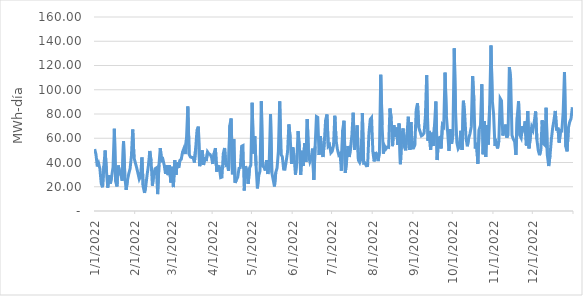
| Category | Excendentes totales [MWh] |
|---|---|
| 1/1/22 | 51.057 |
| 1/2/22 | 46.725 |
| 1/3/22 | 36.693 |
| 1/4/22 | 39.289 |
| 1/5/22 | 34.856 |
| 1/6/22 | 22.641 |
| 1/7/22 | 19.558 |
| 1/8/22 | 37.028 |
| 1/9/22 | 49.878 |
| 1/10/22 | 32.708 |
| 1/11/22 | 19.231 |
| 1/12/22 | 29.342 |
| 1/13/22 | 22.681 |
| 1/14/22 | 28.67 |
| 1/15/22 | 36.096 |
| 1/16/22 | 67.793 |
| 1/17/22 | 24.349 |
| 1/18/22 | 20.233 |
| 1/19/22 | 37.515 |
| 1/20/22 | 32.56 |
| 1/21/22 | 29.501 |
| 1/22/22 | 25.002 |
| 1/23/22 | 57.398 |
| 1/24/22 | 28.121 |
| 1/25/22 | 17.482 |
| 1/26/22 | 25.341 |
| 1/27/22 | 30.878 |
| 1/28/22 | 34.883 |
| 1/29/22 | 45.313 |
| 1/30/22 | 67.203 |
| 1/31/22 | 43.865 |
| 2/1/22 | 39.763 |
| 2/2/22 | 35.76 |
| 2/3/22 | 31.081 |
| 2/4/22 | 26.261 |
| 2/5/22 | 28.488 |
| 2/6/22 | 44.186 |
| 2/7/22 | 20.02 |
| 2/8/22 | 14.933 |
| 2/9/22 | 20.946 |
| 2/10/22 | 30.059 |
| 2/11/22 | 37.817 |
| 2/12/22 | 49.503 |
| 2/13/22 | 41.208 |
| 2/14/22 | 20.891 |
| 2/15/22 | 30.123 |
| 2/16/22 | 34.804 |
| 2/17/22 | 35.525 |
| 2/18/22 | 13.925 |
| 2/19/22 | 38.097 |
| 2/20/22 | 51.924 |
| 2/21/22 | 41.617 |
| 2/22/22 | 42.676 |
| 2/23/22 | 37.812 |
| 2/24/22 | 30.715 |
| 2/25/22 | 37.705 |
| 2/26/22 | 29.585 |
| 2/27/22 | 37.822 |
| 2/28/22 | 23.563 |
| 3/1/22 | 36.43 |
| 3/2/22 | 19.71 |
| 3/3/22 | 41.863 |
| 3/4/22 | 29.853 |
| 3/5/22 | 40.14 |
| 3/6/22 | 35.698 |
| 3/7/22 | 41.761 |
| 3/8/22 | 42.763 |
| 3/9/22 | 48.702 |
| 3/10/22 | 51.553 |
| 3/11/22 | 46.994 |
| 3/12/22 | 60.231 |
| 3/13/22 | 86.146 |
| 3/14/22 | 46.636 |
| 3/15/22 | 44.548 |
| 3/16/22 | 44.171 |
| 3/17/22 | 44.033 |
| 3/18/22 | 40.002 |
| 3/19/22 | 52.051 |
| 3/20/22 | 66.717 |
| 3/21/22 | 69.573 |
| 3/22/22 | 37.018 |
| 3/23/22 | 41.113 |
| 3/24/22 | 50.075 |
| 3/25/22 | 37.943 |
| 3/26/22 | 44.318 |
| 3/27/22 | 41.156 |
| 3/28/22 | 48.76 |
| 3/29/22 | 47.174 |
| 3/30/22 | 46.58 |
| 3/31/22 | 44.514 |
| 4/1/22 | 38.781 |
| 4/2/22 | 47.603 |
| 4/3/22 | 51.846 |
| 4/4/22 | 32.46 |
| 4/5/22 | 36.948 |
| 4/6/22 | 36.616 |
| 4/7/22 | 27.587 |
| 4/8/22 | 27.982 |
| 4/9/22 | 47.308 |
| 4/10/22 | 51.982 |
| 4/11/22 | 37.984 |
| 4/12/22 | 38.863 |
| 4/13/22 | 33.099 |
| 4/14/22 | 70.684 |
| 4/15/22 | 76.239 |
| 4/16/22 | 30.365 |
| 4/17/22 | 59.299 |
| 4/18/22 | 23.258 |
| 4/19/22 | 25.594 |
| 4/20/22 | 27.802 |
| 4/21/22 | 35.186 |
| 4/22/22 | 35.776 |
| 4/23/22 | 53.376 |
| 4/24/22 | 53.947 |
| 4/25/22 | 16.905 |
| 4/26/22 | 37.01 |
| 4/27/22 | 32.621 |
| 4/28/22 | 22.384 |
| 4/29/22 | 35.455 |
| 4/30/22 | 37.831 |
| 5/1/22 | 89.232 |
| 5/2/22 | 47.372 |
| 5/3/22 | 61.634 |
| 5/4/22 | 37.418 |
| 5/5/22 | 18.642 |
| 5/6/22 | 28.996 |
| 5/7/22 | 32.962 |
| 5/8/22 | 90.494 |
| 5/9/22 | 36.927 |
| 5/10/22 | 36.33 |
| 5/11/22 | 33.363 |
| 5/12/22 | 41.861 |
| 5/13/22 | 30.494 |
| 5/14/22 | 39.81 |
| 5/15/22 | 79.81 |
| 5/16/22 | 31.735 |
| 5/17/22 | 26.075 |
| 5/18/22 | 20.221 |
| 5/19/22 | 31.69 |
| 5/20/22 | 35.572 |
| 5/21/22 | 49.218 |
| 5/22/22 | 90.39 |
| 5/23/22 | 46.632 |
| 5/24/22 | 44.801 |
| 5/25/22 | 34.531 |
| 5/26/22 | 34.434 |
| 5/27/22 | 41.304 |
| 5/28/22 | 48.903 |
| 5/29/22 | 71.387 |
| 5/30/22 | 60.318 |
| 5/31/22 | 38.803 |
| 6/1/22 | 52.481 |
| 6/2/22 | 44.414 |
| 6/3/22 | 29.959 |
| 6/4/22 | 40.268 |
| 6/5/22 | 65.824 |
| 6/6/22 | 52.438 |
| 6/7/22 | 29.783 |
| 6/8/22 | 49.68 |
| 6/9/22 | 37.119 |
| 6/10/22 | 55.967 |
| 6/11/22 | 40.438 |
| 6/12/22 | 75.813 |
| 6/13/22 | 45.897 |
| 6/14/22 | 40.648 |
| 6/15/22 | 43.74 |
| 6/16/22 | 51.434 |
| 6/17/22 | 25.695 |
| 6/18/22 | 53.229 |
| 6/19/22 | 77.811 |
| 6/20/22 | 77.187 |
| 6/21/22 | 46.193 |
| 6/22/22 | 61.855 |
| 6/23/22 | 50.749 |
| 6/24/22 | 44.512 |
| 6/25/22 | 56.793 |
| 6/26/22 | 75.059 |
| 6/27/22 | 79.635 |
| 6/28/22 | 53.391 |
| 6/29/22 | 54.566 |
| 6/30/22 | 47.944 |
| 7/1/22 | 49.185 |
| 7/2/22 | 53.859 |
| 7/3/22 | 78.51 |
| 7/4/22 | 58.017 |
| 7/5/22 | 50.825 |
| 7/6/22 | 46.258 |
| 7/7/22 | 47.272 |
| 7/8/22 | 33.265 |
| 7/9/22 | 66.77 |
| 7/10/22 | 74.369 |
| 7/11/22 | 31.449 |
| 7/12/22 | 41.662 |
| 7/13/22 | 53.642 |
| 7/14/22 | 44.558 |
| 7/15/22 | 52.114 |
| 7/16/22 | 62.465 |
| 7/17/22 | 81.035 |
| 7/18/22 | 50.538 |
| 7/19/22 | 57.756 |
| 7/20/22 | 70.599 |
| 7/21/22 | 41.857 |
| 7/22/22 | 39.917 |
| 7/23/22 | 42.983 |
| 7/24/22 | 80.845 |
| 7/25/22 | 39.387 |
| 7/26/22 | 39.581 |
| 7/27/22 | 37.297 |
| 7/28/22 | 37.481 |
| 7/29/22 | 63.985 |
| 7/30/22 | 75.601 |
| 7/31/22 | 76.986 |
| 8/1/22 | 48.795 |
| 8/2/22 | 40.914 |
| 8/3/22 | 48.636 |
| 8/4/22 | 45.923 |
| 8/5/22 | 41.144 |
| 8/6/22 | 48.694 |
| 8/7/22 | 112.307 |
| 8/8/22 | 70.859 |
| 8/9/22 | 47.317 |
| 8/10/22 | 53.472 |
| 8/11/22 | 51.287 |
| 8/12/22 | 52.758 |
| 8/13/22 | 52.498 |
| 8/14/22 | 84.57 |
| 8/15/22 | 76.447 |
| 8/16/22 | 53.483 |
| 8/17/22 | 70.694 |
| 8/18/22 | 61.343 |
| 8/19/22 | 68.811 |
| 8/20/22 | 54.531 |
| 8/21/22 | 72.112 |
| 8/22/22 | 38.622 |
| 8/23/22 | 61.588 |
| 8/24/22 | 68.093 |
| 8/25/22 | 53.005 |
| 8/26/22 | 50.028 |
| 8/27/22 | 63.605 |
| 8/28/22 | 77.77 |
| 8/29/22 | 50.453 |
| 8/30/22 | 73.264 |
| 8/31/22 | 51.866 |
| 9/1/22 | 51.938 |
| 9/2/22 | 54.346 |
| 9/3/22 | 83.265 |
| 9/4/22 | 88.835 |
| 9/5/22 | 68.951 |
| 9/6/22 | 65.327 |
| 9/7/22 | 61.983 |
| 9/8/22 | 62.722 |
| 9/9/22 | 64.252 |
| 9/10/22 | 77.754 |
| 9/11/22 | 111.944 |
| 9/12/22 | 58.01 |
| 9/13/22 | 66.049 |
| 9/14/22 | 50.317 |
| 9/15/22 | 64.611 |
| 9/16/22 | 53.587 |
| 9/17/22 | 71.317 |
| 9/18/22 | 90.263 |
| 9/19/22 | 42.006 |
| 9/20/22 | 60.276 |
| 9/21/22 | 60.726 |
| 9/22/22 | 51.579 |
| 9/23/22 | 70.97 |
| 9/24/22 | 69.581 |
| 9/25/22 | 114.114 |
| 9/26/22 | 78.647 |
| 9/27/22 | 64.673 |
| 9/28/22 | 49.569 |
| 9/29/22 | 67.348 |
| 9/30/22 | 55.493 |
| 10/1/22 | 63.344 |
| 10/2/22 | 134.143 |
| 10/3/22 | 82.194 |
| 10/4/22 | 56.455 |
| 10/5/22 | 51.366 |
| 10/6/22 | 53.205 |
| 10/7/22 | 66.157 |
| 10/8/22 | 50.337 |
| 10/9/22 | 90.891 |
| 10/10/22 | 78.957 |
| 10/11/22 | 59.76 |
| 10/12/22 | 53.386 |
| 10/13/22 | 59.935 |
| 10/14/22 | 63.854 |
| 10/15/22 | 69.559 |
| 10/16/22 | 111.344 |
| 10/17/22 | 91.074 |
| 10/18/22 | 51.499 |
| 10/19/22 | 56.229 |
| 10/20/22 | 38.951 |
| 10/21/22 | 67.177 |
| 10/22/22 | 70.681 |
| 10/23/22 | 104.466 |
| 10/24/22 | 46.836 |
| 10/25/22 | 74.073 |
| 10/26/22 | 44.506 |
| 10/27/22 | 70.871 |
| 10/28/22 | 54.859 |
| 10/29/22 | 86.777 |
| 10/30/22 | 136.565 |
| 10/31/22 | 91.188 |
| 11/1/22 | 79.858 |
| 11/2/22 | 53.663 |
| 11/3/22 | 56.264 |
| 11/4/22 | 51.615 |
| 11/5/22 | 57.818 |
| 11/6/22 | 92.833 |
| 11/7/22 | 90.925 |
| 11/8/22 | 62.214 |
| 11/9/22 | 66.598 |
| 11/10/22 | 71.27 |
| 11/11/22 | 60.523 |
| 11/12/22 | 63.027 |
| 11/13/22 | 118.66 |
| 11/14/22 | 108.89 |
| 11/15/22 | 62.49 |
| 11/16/22 | 59.223 |
| 11/17/22 | 57.441 |
| 11/18/22 | 46.226 |
| 11/19/22 | 77.352 |
| 11/20/22 | 90.464 |
| 11/21/22 | 62.431 |
| 11/22/22 | 60.289 |
| 11/23/22 | 69.913 |
| 11/24/22 | 67.275 |
| 11/25/22 | 73.913 |
| 11/26/22 | 54.024 |
| 11/27/22 | 82.384 |
| 11/28/22 | 51.667 |
| 11/29/22 | 60.986 |
| 11/30/22 | 69.314 |
| 12/1/22 | 66.743 |
| 12/2/22 | 73.694 |
| 12/3/22 | 82.122 |
| 12/4/22 | 58.889 |
| 12/5/22 | 50.11 |
| 12/6/22 | 46.036 |
| 12/7/22 | 50.696 |
| 12/8/22 | 74.846 |
| 12/9/22 | 55.385 |
| 12/10/22 | 54.33 |
| 12/11/22 | 85.164 |
| 12/12/22 | 45.584 |
| 12/13/22 | 37.099 |
| 12/14/22 | 45.939 |
| 12/15/22 | 58.992 |
| 12/16/22 | 68.447 |
| 12/17/22 | 75.014 |
| 12/18/22 | 82.536 |
| 12/19/22 | 66.371 |
| 12/20/22 | 68.799 |
| 12/21/22 | 56.413 |
| 12/22/22 | 66.398 |
| 12/23/22 | 66.069 |
| 12/24/22 | 81.434 |
| 12/25/22 | 114.691 |
| 12/26/22 | 53.067 |
| 12/27/22 | 49.185 |
| 12/28/22 | 68.648 |
| 12/29/22 | 73.492 |
| 12/30/22 | 76.228 |
| 12/31/22 | 85.582 |